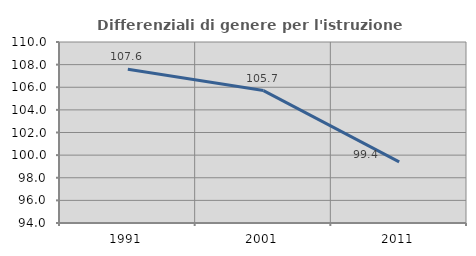
| Category | Differenziali di genere per l'istruzione superiore |
|---|---|
| 1991.0 | 107.592 |
| 2001.0 | 105.706 |
| 2011.0 | 99.405 |